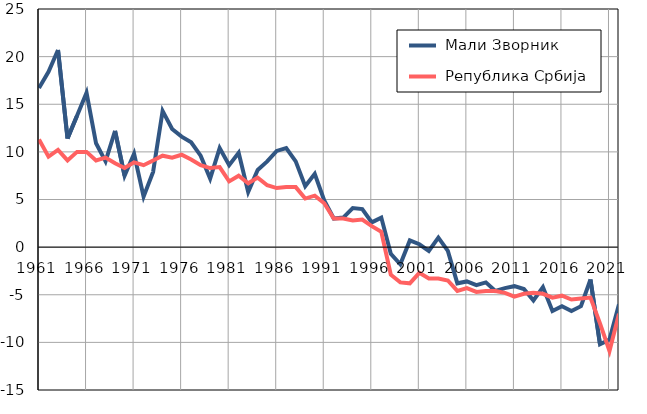
| Category |  Мали Зворник |  Република Србија |
|---|---|---|
| 1961.0 | 16.7 | 11.3 |
| 1962.0 | 18.4 | 9.5 |
| 1963.0 | 20.7 | 10.2 |
| 1964.0 | 11.4 | 9.1 |
| 1965.0 | 13.8 | 10 |
| 1966.0 | 16.2 | 10 |
| 1967.0 | 10.9 | 9.1 |
| 1968.0 | 9 | 9.4 |
| 1969.0 | 12.2 | 8.8 |
| 1970.0 | 7.5 | 8.3 |
| 1971.0 | 9.8 | 8.9 |
| 1972.0 | 5.3 | 8.6 |
| 1973.0 | 7.9 | 9.1 |
| 1974.0 | 14.3 | 9.6 |
| 1975.0 | 12.4 | 9.4 |
| 1976.0 | 11.6 | 9.7 |
| 1977.0 | 11 | 9.2 |
| 1978.0 | 9.6 | 8.6 |
| 1979.0 | 7.2 | 8.3 |
| 1980.0 | 10.4 | 8.4 |
| 1981.0 | 8.6 | 6.9 |
| 1982.0 | 9.9 | 7.5 |
| 1983.0 | 5.8 | 6.7 |
| 1984.0 | 8.1 | 7.3 |
| 1985.0 | 9 | 6.5 |
| 1986.0 | 10.1 | 6.2 |
| 1987.0 | 10.4 | 6.3 |
| 1988.0 | 9 | 6.3 |
| 1989.0 | 6.4 | 5.1 |
| 1990.0 | 7.7 | 5.4 |
| 1991.0 | 4.9 | 4.6 |
| 1992.0 | 3 | 3 |
| 1993.0 | 3.1 | 3 |
| 1994.0 | 4.1 | 2.8 |
| 1995.0 | 4 | 2.9 |
| 1996.0 | 2.6 | 2.2 |
| 1997.0 | 3.1 | 1.6 |
| 1998.0 | -0.7 | -2.9 |
| 1999.0 | -1.8 | -3.7 |
| 2000.0 | 0.7 | -3.8 |
| 2001.0 | 0.3 | -2.7 |
| 2002.0 | -0.4 | -3.3 |
| 2003.0 | 1 | -3.3 |
| 2004.0 | -0.4 | -3.5 |
| 2005.0 | -3.8 | -4.6 |
| 2006.0 | -3.6 | -4.3 |
| 2007.0 | -4 | -4.7 |
| 2008.0 | -3.7 | -4.6 |
| 2009.0 | -4.6 | -4.6 |
| 2010.0 | -4.3 | -4.8 |
| 2011.0 | -4.1 | -5.2 |
| 2012.0 | -4.4 | -4.9 |
| 2013.0 | -5.6 | -4.8 |
| 2014.0 | -4.2 | -4.9 |
| 2015.0 | -6.7 | -5.3 |
| 2016.0 | -6.2 | -5.1 |
| 2017.0 | -6.7 | -5.5 |
| 2018.0 | -6.2 | -5.4 |
| 2019.0 | -3.4 | -5.3 |
| 2020.0 | -10.2 | -8 |
| 2021.0 | -9.7 | -10.9 |
| 2022.0 | -6 | -7 |